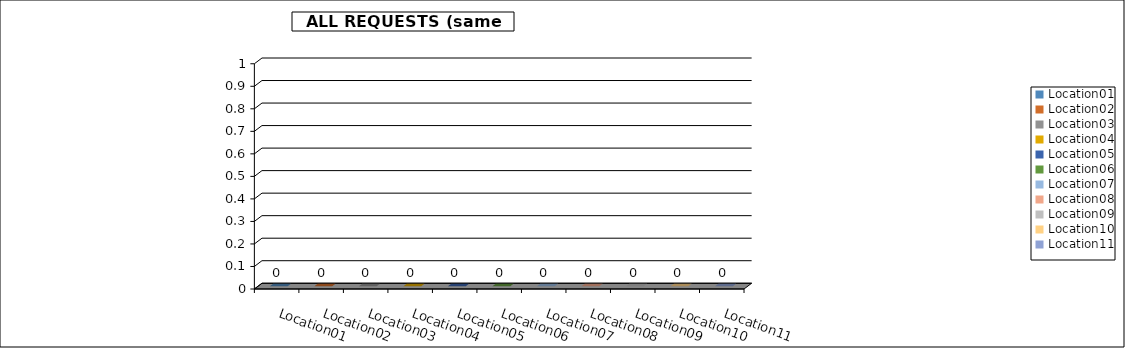
| Category | Series 0 |
|---|---|
| Location01 | 0 |
| Location02 | 0 |
| Location03 | 0 |
| Location04 | 0 |
| Location05 | 0 |
| Location06 | 0 |
| Location07 | 0 |
| Location08 | 0 |
| Location09 | 0 |
| Location10 | 0 |
| Location11 | 0 |